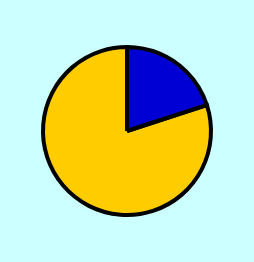
| Category | Series 0 |
|---|---|
| 0 | 1 |
| 1 | 4 |